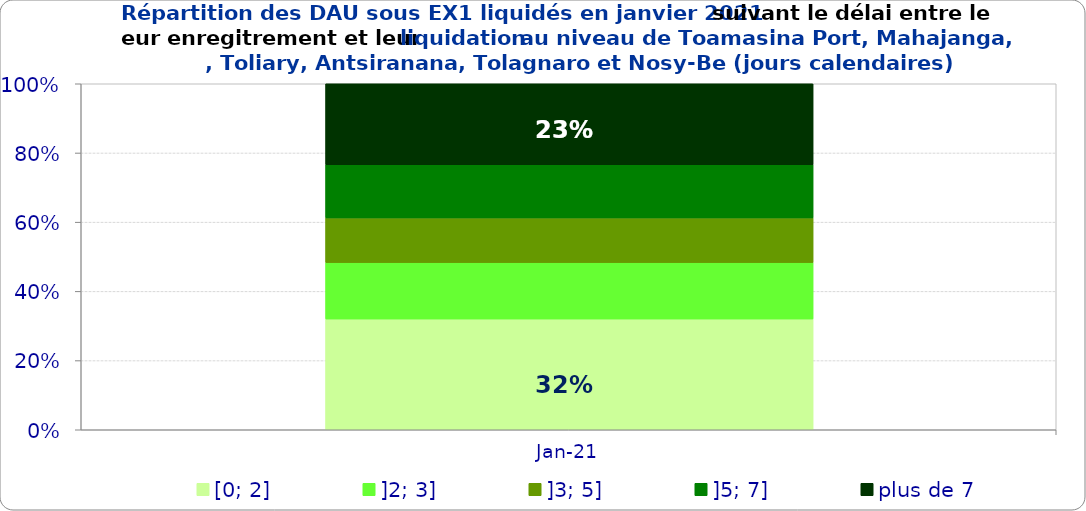
| Category | [0; 2] | ]2; 3] | ]3; 5] | ]5; 7] | plus de 7 |
|---|---|---|---|---|---|
| 2021-01-01 | 0.32 | 0.163 | 0.129 | 0.154 | 0.234 |